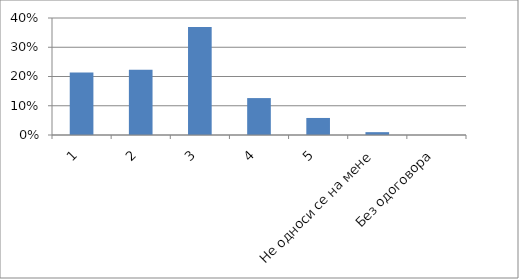
| Category | Series 0 |
|---|---|
| 1 | 0.214 |
| 2 | 0.223 |
| 3 | 0.369 |
| 4 | 0.126 |
| 5 | 0.058 |
| Не односи се на мене | 0.01 |
| Без одоговора | 0 |